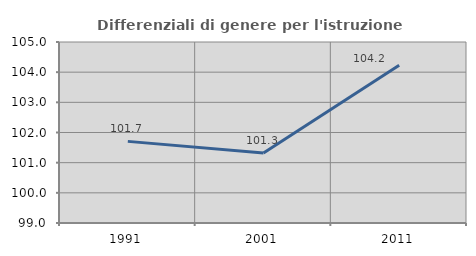
| Category | Differenziali di genere per l'istruzione superiore |
|---|---|
| 1991.0 | 101.706 |
| 2001.0 | 101.324 |
| 2011.0 | 104.227 |